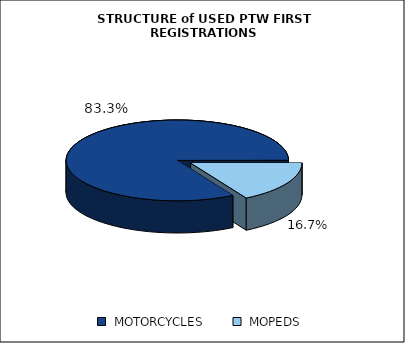
| Category | TOTAL |
|---|---|
|  MOTORCYCLES  | 0.833 |
|  MOPEDS  | 0.167 |